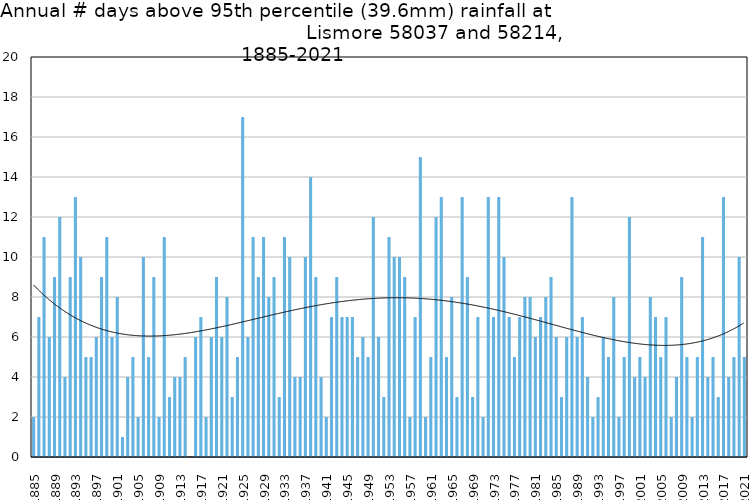
| Category | Annual # days above 95th percentile |
|---|---|
| 1885 | 2 |
| 1886 | 7 |
| 1887 | 11 |
| 1888 | 6 |
| 1889 | 9 |
| 1890 | 12 |
| 1891 | 4 |
| 1892 | 9 |
| 1893 | 13 |
| 1894 | 10 |
| 1895 | 5 |
| 1896 | 5 |
| 1897 | 6 |
| 1898 | 9 |
| 1899 | 11 |
| 1900 | 6 |
| 1901 | 8 |
| 1902 | 1 |
| 1903 | 4 |
| 1904 | 5 |
| 1905 | 2 |
| 1906 | 10 |
| 1907 | 5 |
| 1908 | 9 |
| 1909 | 2 |
| 1910 | 11 |
| 1911 | 3 |
| 1912 | 4 |
| 1913 | 4 |
| 1914 | 5 |
| 1915 | 0 |
| 1916 | 6 |
| 1917 | 7 |
| 1918 | 2 |
| 1919 | 6 |
| 1920 | 9 |
| 1921 | 6 |
| 1922 | 8 |
| 1923 | 3 |
| 1924 | 5 |
| 1925 | 17 |
| 1926 | 6 |
| 1927 | 11 |
| 1928 | 9 |
| 1929 | 11 |
| 1930 | 8 |
| 1931 | 9 |
| 1932 | 3 |
| 1933 | 11 |
| 1934 | 10 |
| 1935 | 4 |
| 1936 | 4 |
| 1937 | 10 |
| 1938 | 14 |
| 1939 | 9 |
| 1940 | 4 |
| 1941 | 2 |
| 1942 | 7 |
| 1943 | 9 |
| 1944 | 7 |
| 1945 | 7 |
| 1946 | 7 |
| 1947 | 5 |
| 1948 | 6 |
| 1949 | 5 |
| 1950 | 12 |
| 1951 | 6 |
| 1952 | 3 |
| 1953 | 11 |
| 1954 | 10 |
| 1955 | 10 |
| 1956 | 9 |
| 1957 | 2 |
| 1958 | 7 |
| 1959 | 15 |
| 1960 | 2 |
| 1961 | 5 |
| 1962 | 12 |
| 1963 | 13 |
| 1964 | 5 |
| 1965 | 8 |
| 1966 | 3 |
| 1967 | 13 |
| 1968 | 9 |
| 1969 | 3 |
| 1970 | 7 |
| 1971 | 2 |
| 1972 | 13 |
| 1973 | 7 |
| 1974 | 13 |
| 1975 | 10 |
| 1976 | 7 |
| 1977 | 5 |
| 1978 | 7 |
| 1979 | 8 |
| 1980 | 8 |
| 1981 | 6 |
| 1982 | 7 |
| 1983 | 8 |
| 1984 | 9 |
| 1985 | 6 |
| 1986 | 3 |
| 1987 | 6 |
| 1988 | 13 |
| 1989 | 6 |
| 1990 | 7 |
| 1991 | 4 |
| 1992 | 2 |
| 1993 | 3 |
| 1994 | 6 |
| 1995 | 5 |
| 1996 | 8 |
| 1997 | 2 |
| 1998 | 5 |
| 1999 | 12 |
| 2000 | 4 |
| 2001 | 5 |
| 2002 | 4 |
| 2003 | 8 |
| 2004 | 7 |
| 2005 | 5 |
| 2006 | 7 |
| 2007 | 2 |
| 2008 | 4 |
| 2009 | 9 |
| 2010 | 5 |
| 2011 | 2 |
| 2012 | 5 |
| 2013 | 11 |
| 2014 | 4 |
| 2015 | 5 |
| 2016 | 3 |
| 2017 | 13 |
| 2018 | 4 |
| 2019 | 5 |
| 2020 | 10 |
| 2021 | 5 |